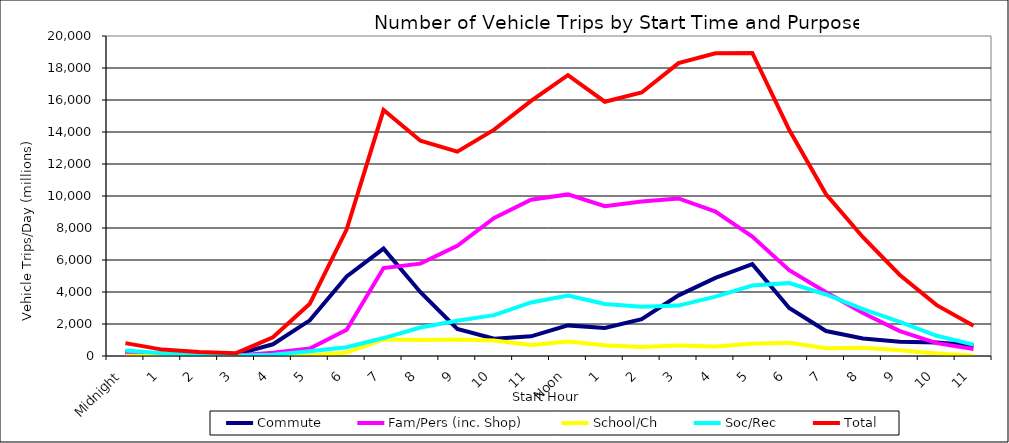
| Category | Commute | Fam/Pers (inc. Shop) | School/Ch | Soc/Rec | Total |
|---|---|---|---|---|---|
| Midnight | 254.8 | 171.6 | 11.48 | 338.5 | 804.03 |
| 1 | 135.1 | 62.53 | 1.13 | 179 | 399.64 |
| 2 | 114.4 | 18.72 | 1.784 | 109.7 | 255.544 |
| 3 | 103.1 | 32.01 | 0.195 | 34.76 | 175.963 |
| 4 | 732 | 197.2 | 4.01 | 75.4 | 1170.71 |
| 5 | 2230 | 465.2 | 29.44 | 298.5 | 3266.24 |
| 6 | 4974 | 1645 | 224 | 544.9 | 7920.6 |
| 7 | 6713 | 5495 | 1041 | 1121 | 15371 |
| 8 | 3988 | 5772 | 1003 | 1780 | 13453.6 |
| 9 | 1696 | 6886 | 1027 | 2202 | 12770.2 |
| 10 | 1079 | 8624 | 965.9 | 2556 | 14145.6 |
| 11 | 1230 | 9764 | 682.1 | 3346 | 15940.9 |
| Noon | 1913 | 10100 | 901.4 | 3775 | 17551.7 |
| 1 | 1754 | 9360 | 666.3 | 3247 | 15892.3 |
| 2 | 2298 | 9652 | 557.5 | 3081 | 16466.5 |
| 3 | 3791 | 9845 | 658.1 | 3149 | 18306.4 |
| 4 | 4886 | 9031 | 596.2 | 3711 | 18923.9 |
| 5 | 5740 | 7469 | 763.5 | 4405 | 18942.6 |
| 6 | 3004 | 5361 | 825.5 | 4564 | 14137.6 |
| 7 | 1563 | 3981 | 491.5 | 3845 | 10105 |
| 8 | 1096 | 2688 | 514.5 | 2928 | 7421.7 |
| 9 | 885.6 | 1560 | 352 | 2134 | 5061.5 |
| 10 | 846.4 | 805.9 | 159.2 | 1263 | 3179.6 |
| 11 | 672.2 | 437.4 | 14.98 | 710.1 | 1884.07 |